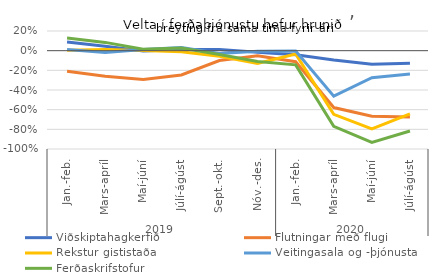
| Category | Viðskiptahagkerfið | Flutningar með flugi | Rekstur gististaða | Veitingasala og -þjónusta | Ferðaskrifstofur |
|---|---|---|---|---|---|
| 0 | 8.921 | -20.965 | 0.318 | 1.248 | 12.872 |
| 1 | 4.547 | -26.045 | 1.298 | -1.886 | 8.414 |
| 2 | -0.39 | -29.247 | 0.261 | 1.188 | 1.477 |
| 3 | 1.137 | -24.684 | -1.029 | 3.157 | 2.646 |
| 4 | 1.182 | -10.08 | -5.602 | -2.959 | -3.818 |
| 5 | -1.531 | -5.187 | -13.09 | -0.691 | -10.928 |
| 6 | -4.12 | -11.259 | -3.389 | -0.37 | -14.418 |
| 7 | -9.497 | -57.855 | -64.799 | -46.297 | -76.961 |
| 8 | -13.823 | -66.59 | -79.525 | -27.546 | -93.378 |
| 9 | -12.872 | -67.469 | -64.306 | -23.768 | -81.686 |